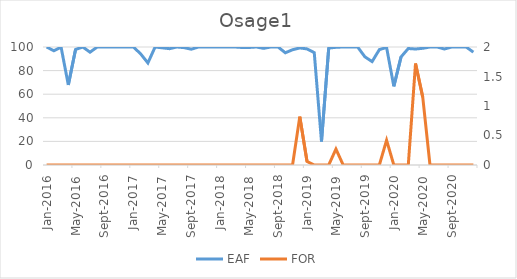
| Category | EAF |
|---|---|
| 2016-01-01 | 100 |
| 2016-02-01 | 96.81 |
| 2016-03-01 | 99.89 |
| 2016-04-01 | 67.86 |
| 2016-05-01 | 97.92 |
| 2016-06-01 | 100 |
| 2016-07-01 | 95.6 |
| 2016-08-01 | 100 |
| 2016-09-01 | 100 |
| 2016-10-01 | 100 |
| 2016-11-01 | 100 |
| 2016-12-01 | 100 |
| 2017-01-01 | 100 |
| 2017-02-01 | 94.18 |
| 2017-03-01 | 86.47 |
| 2017-04-01 | 100 |
| 2017-05-01 | 99.31 |
| 2017-06-01 | 98.57 |
| 2017-07-01 | 100 |
| 2017-08-01 | 99.46 |
| 2017-09-01 | 98.13 |
| 2017-10-01 | 100 |
| 2017-11-01 | 100 |
| 2017-12-01 | 100 |
| 2018-01-01 | 100 |
| 2018-02-01 | 100 |
| 2018-03-01 | 100 |
| 2018-04-01 | 99.58 |
| 2018-05-01 | 99.6 |
| 2018-06-01 | 100 |
| 2018-07-01 | 98.86 |
| 2018-08-01 | 100 |
| 2018-09-01 | 100 |
| 2018-10-01 | 95.09 |
| 2018-11-01 | 97.69 |
| 2018-12-01 | 99.19 |
| 2019-01-01 | 98.39 |
| 2019-02-01 | 95.23 |
| 2019-03-01 | 19.92 |
| 2019-04-01 | 99.08 |
| 2019-05-01 | 99.73 |
| 2019-06-01 | 100 |
| 2019-07-01 | 100 |
| 2019-08-01 | 100 |
| 2019-09-01 | 91.69 |
| 2019-10-01 | 87.65 |
| 2019-11-01 | 97.78 |
| 2019-12-01 | 99.62 |
| 2020-01-01 | 66.68 |
| 2020-02-01 | 91.59 |
| 2020-03-01 | 98.72 |
| 2020-04-01 | 98.29 |
| 2020-05-01 | 98.89 |
| 2020-06-01 | 100 |
| 2020-07-01 | 100 |
| 2020-08-01 | 98.3 |
| 2020-09-01 | 100 |
| 2020-10-01 | 100 |
| 2020-11-01 | 100 |
| 2020-12-01 | 95.63 |